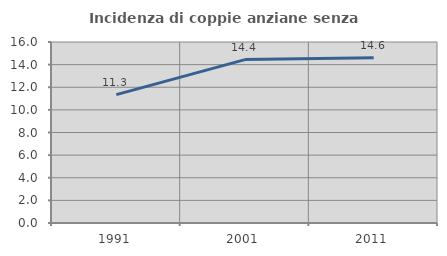
| Category | Incidenza di coppie anziane senza figli  |
|---|---|
| 1991.0 | 11.349 |
| 2001.0 | 14.444 |
| 2011.0 | 14.61 |